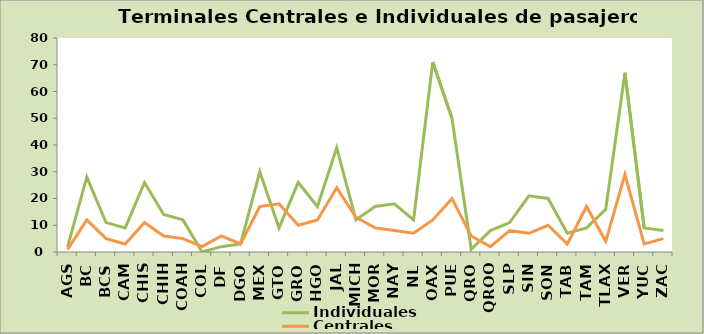
| Category | Individuales | Centrales |
|---|---|---|
| AGS | 2 | 1 |
| BC | 28 | 12 |
| BCS | 11 | 5 |
| CAM | 9 | 3 |
| CHIS | 26 | 11 |
| CHIH | 14 | 6 |
| COAH | 12 | 5 |
| COL | 0 | 2 |
| DF | 2 | 6 |
| DGO | 3 | 3 |
| MEX | 30 | 17 |
| GTO | 9 | 18 |
| GRO | 26 | 10 |
| HGO | 17 | 12 |
| JAL | 39 | 24 |
| MICH | 12 | 13 |
| MOR | 17 | 9 |
| NAY | 18 | 8 |
| NL | 12 | 7 |
| OAX | 71 | 12 |
| PUE | 50 | 20 |
| QRO | 1 | 6 |
| QROO | 8 | 2 |
| SLP | 11 | 8 |
| SIN | 21 | 7 |
| SON | 20 | 10 |
| TAB | 7 | 3 |
| TAM | 9 | 17 |
| TLAX | 16 | 4 |
| VER | 67 | 29 |
| YUC | 9 | 3 |
| ZAC | 8 | 5 |